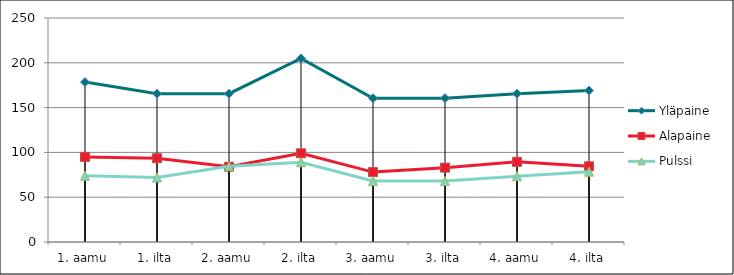
| Category | Yläpaine | Alapaine | Pulssi |
|---|---|---|---|
| 1. aamu | 178.5 | 95 | 74 |
| 1. ilta | 165.5 | 93.5 | 72 |
| 2. aamu | 165.5 | 84 | 84.5 |
| 2. ilta | 205 | 99 | 89 |
| 3. aamu | 160.5 | 78 | 68 |
| 3. ilta | 160.5 | 83 | 68 |
| 4. aamu | 165.5 | 89.5 | 73.5 |
| 4. ilta | 169 | 84.5 | 78.5 |